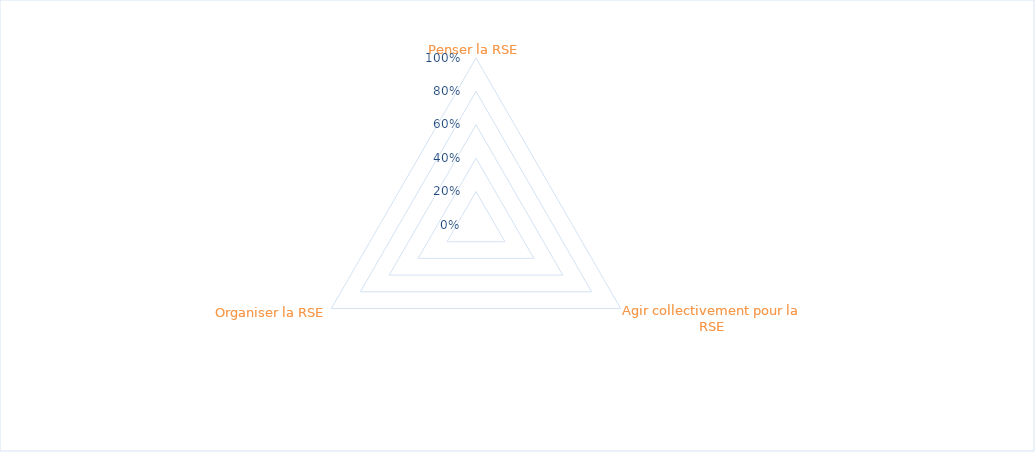
| Category | Series 0 |
|---|---|
| Penser la RSE | 0 |
| Agir collectivement pour la RSE | 0 |
| Organiser la RSE | 0 |